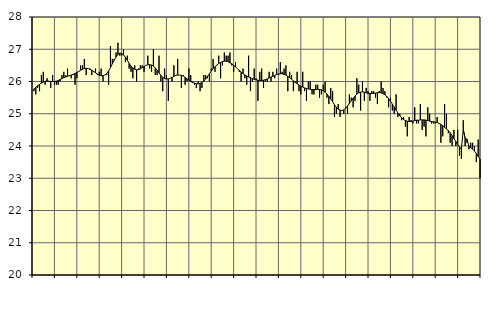
| Category | Piggar | Series 1 |
|---|---|---|
| nan | 25.7 | 25.77 |
| 1.0 | 25.6 | 25.82 |
| 1.0 | 25.8 | 25.87 |
| 1.0 | 25.7 | 25.91 |
| 1.0 | 26.2 | 25.95 |
| 1.0 | 26.3 | 25.98 |
| 1.0 | 25.9 | 26.01 |
| 1.0 | 26.1 | 26.01 |
| 1.0 | 26 | 26.01 |
| 1.0 | 25.8 | 26 |
| 1.0 | 26.2 | 26 |
| 1.0 | 25.9 | 26 |
| nan | 25.9 | 26.01 |
| 2.0 | 25.9 | 26.03 |
| 2.0 | 26 | 26.06 |
| 2.0 | 26.2 | 26.09 |
| 2.0 | 26.3 | 26.12 |
| 2.0 | 26.2 | 26.14 |
| 2.0 | 26.4 | 26.16 |
| 2.0 | 26.2 | 26.18 |
| 2.0 | 26.1 | 26.2 |
| 2.0 | 26.2 | 26.22 |
| 2.0 | 25.9 | 26.25 |
| 2.0 | 26.1 | 26.28 |
| nan | 26.3 | 26.31 |
| 3.0 | 26.5 | 26.35 |
| 3.0 | 26.5 | 26.38 |
| 3.0 | 26.7 | 26.4 |
| 3.0 | 26.2 | 26.41 |
| 3.0 | 26.4 | 26.4 |
| 3.0 | 26.4 | 26.38 |
| 3.0 | 26.2 | 26.35 |
| 3.0 | 26.3 | 26.31 |
| 3.0 | 26.4 | 26.27 |
| 3.0 | 26.2 | 26.23 |
| 3.0 | 26.3 | 26.19 |
| nan | 26.4 | 26.18 |
| 4.0 | 26 | 26.18 |
| 4.0 | 26.2 | 26.2 |
| 4.0 | 26.2 | 26.25 |
| 4.0 | 25.9 | 26.33 |
| 4.0 | 27.1 | 26.43 |
| 4.0 | 26.7 | 26.55 |
| 4.0 | 26.7 | 26.66 |
| 4.0 | 26.9 | 26.76 |
| 4.0 | 27.2 | 26.84 |
| 4.0 | 26.8 | 26.88 |
| 4.0 | 26.8 | 26.87 |
| nan | 27 | 26.83 |
| 5.0 | 26.6 | 26.75 |
| 5.0 | 26.8 | 26.66 |
| 5.0 | 26.4 | 26.56 |
| 5.0 | 26.3 | 26.48 |
| 5.0 | 26.1 | 26.42 |
| 5.0 | 26.5 | 26.38 |
| 5.0 | 26 | 26.36 |
| 5.0 | 26.4 | 26.37 |
| 5.0 | 26.5 | 26.39 |
| 5.0 | 26.5 | 26.43 |
| 5.0 | 26.3 | 26.46 |
| nan | 26.5 | 26.5 |
| 6.0 | 26.8 | 26.52 |
| 6.0 | 26.4 | 26.52 |
| 6.0 | 26.3 | 26.51 |
| 6.0 | 27 | 26.48 |
| 6.0 | 26.2 | 26.42 |
| 6.0 | 26.2 | 26.35 |
| 6.0 | 26.8 | 26.27 |
| 6.0 | 26 | 26.19 |
| 6.0 | 25.7 | 26.13 |
| 6.0 | 26.4 | 26.09 |
| 6.0 | 26.2 | 26.08 |
| nan | 25.4 | 26.08 |
| 7.0 | 26.1 | 26.1 |
| 7.0 | 26 | 26.13 |
| 7.0 | 26.5 | 26.16 |
| 7.0 | 26.2 | 26.19 |
| 7.0 | 26.7 | 26.2 |
| 7.0 | 26.2 | 26.2 |
| 7.0 | 25.8 | 26.19 |
| 7.0 | 26.2 | 26.17 |
| 7.0 | 25.9 | 26.13 |
| 7.0 | 26 | 26.08 |
| 7.0 | 26.4 | 26.04 |
| nan | 26.2 | 26 |
| 8.0 | 26 | 25.97 |
| 8.0 | 25.9 | 25.95 |
| 8.0 | 25.8 | 25.93 |
| 8.0 | 26 | 25.93 |
| 8.0 | 25.7 | 25.94 |
| 8.0 | 25.8 | 25.97 |
| 8.0 | 26.2 | 26.01 |
| 8.0 | 26.2 | 26.08 |
| 8.0 | 26.1 | 26.16 |
| 8.0 | 26 | 26.24 |
| 8.0 | 26.4 | 26.32 |
| nan | 26.7 | 26.4 |
| 9.0 | 26.3 | 26.46 |
| 9.0 | 26.5 | 26.51 |
| 9.0 | 26.8 | 26.56 |
| 9.0 | 26.1 | 26.59 |
| 9.0 | 26.5 | 26.62 |
| 9.0 | 26.9 | 26.63 |
| 9.0 | 26.8 | 26.63 |
| 9.0 | 26.8 | 26.61 |
| 9.0 | 26.9 | 26.58 |
| 9.0 | 26.5 | 26.55 |
| 9.0 | 26.3 | 26.5 |
| nan | 26.6 | 26.45 |
| 10.0 | 26.4 | 26.4 |
| 10.0 | 26.3 | 26.35 |
| 10.0 | 26 | 26.29 |
| 10.0 | 26.4 | 26.24 |
| 10.0 | 26.1 | 26.2 |
| 10.0 | 25.9 | 26.17 |
| 10.0 | 26.8 | 26.14 |
| 10.0 | 25.7 | 26.12 |
| 10.0 | 26 | 26.09 |
| 10.0 | 26.4 | 26.07 |
| 10.0 | 26.1 | 26.05 |
| nan | 25.4 | 26.04 |
| 11.0 | 26.3 | 26.03 |
| 11.0 | 26.4 | 26.03 |
| 11.0 | 25.8 | 26.04 |
| 11.0 | 26 | 26.06 |
| 11.0 | 26 | 26.08 |
| 11.0 | 26.3 | 26.11 |
| 11.0 | 26 | 26.14 |
| 11.0 | 26.3 | 26.16 |
| 11.0 | 26.1 | 26.19 |
| 11.0 | 26.4 | 26.22 |
| 11.0 | 26.2 | 26.23 |
| nan | 26.6 | 26.24 |
| 12.0 | 26.3 | 26.24 |
| 12.0 | 26.4 | 26.22 |
| 12.0 | 26.5 | 26.2 |
| 12.0 | 25.7 | 26.16 |
| 12.0 | 26.3 | 26.12 |
| 12.0 | 26.2 | 26.07 |
| 12.0 | 25.7 | 26.02 |
| 12.0 | 26 | 25.97 |
| 12.0 | 26.3 | 25.93 |
| 12.0 | 25.7 | 25.89 |
| 12.0 | 25.6 | 25.85 |
| nan | 26.3 | 25.83 |
| 13.0 | 25.7 | 25.8 |
| 13.0 | 25.4 | 25.78 |
| 13.0 | 26 | 25.77 |
| 13.0 | 26 | 25.76 |
| 13.0 | 25.6 | 25.75 |
| 13.0 | 25.6 | 25.75 |
| 13.0 | 25.9 | 25.75 |
| 13.0 | 25.9 | 25.76 |
| 13.0 | 25.5 | 25.75 |
| 13.0 | 25.6 | 25.74 |
| 13.0 | 25.9 | 25.71 |
| nan | 26 | 25.67 |
| 14.0 | 25.5 | 25.61 |
| 14.0 | 25.3 | 25.54 |
| 14.0 | 25.8 | 25.46 |
| 14.0 | 25.7 | 25.37 |
| 14.0 | 24.9 | 25.28 |
| 14.0 | 25 | 25.2 |
| 14.0 | 25.3 | 25.14 |
| 14.0 | 24.9 | 25.11 |
| 14.0 | 25.1 | 25.1 |
| 14.0 | 25 | 25.12 |
| 14.0 | 25.2 | 25.17 |
| nan | 25 | 25.24 |
| 15.0 | 25.6 | 25.32 |
| 15.0 | 25.5 | 25.4 |
| 15.0 | 25.2 | 25.48 |
| 15.0 | 25.4 | 25.55 |
| 15.0 | 26.1 | 25.61 |
| 15.0 | 25.9 | 25.65 |
| 15.0 | 25.1 | 25.67 |
| 15.0 | 26 | 25.68 |
| 15.0 | 25.4 | 25.67 |
| 15.0 | 25.8 | 25.65 |
| 15.0 | 25.7 | 25.63 |
| nan | 25.4 | 25.63 |
| 16.0 | 25.7 | 25.63 |
| 16.0 | 25.7 | 25.63 |
| 16.0 | 25.5 | 25.64 |
| 16.0 | 25.3 | 25.65 |
| 16.0 | 25.7 | 25.66 |
| 16.0 | 26 | 25.65 |
| 16.0 | 25.8 | 25.62 |
| 16.0 | 25.7 | 25.59 |
| 16.0 | 25.5 | 25.54 |
| 16.0 | 25.2 | 25.47 |
| 16.0 | 25.5 | 25.39 |
| nan | 25.1 | 25.3 |
| 17.0 | 25 | 25.21 |
| 17.0 | 25.6 | 25.11 |
| 17.0 | 24.9 | 25.02 |
| 17.0 | 25 | 24.94 |
| 17.0 | 24.8 | 24.88 |
| 17.0 | 24.9 | 24.82 |
| 17.0 | 24.6 | 24.79 |
| 17.0 | 24.3 | 24.77 |
| 17.0 | 24.9 | 24.76 |
| 17.0 | 24.8 | 24.76 |
| 17.0 | 24.7 | 24.77 |
| nan | 25.2 | 24.79 |
| 18.0 | 24.7 | 24.8 |
| 18.0 | 24.7 | 24.8 |
| 18.0 | 25.3 | 24.81 |
| 18.0 | 24.5 | 24.81 |
| 18.0 | 24.6 | 24.81 |
| 18.0 | 24.3 | 24.8 |
| 18.0 | 25.2 | 24.79 |
| 18.0 | 25 | 24.77 |
| 18.0 | 24.7 | 24.76 |
| 18.0 | 24.7 | 24.75 |
| 18.0 | 24.7 | 24.74 |
| nan | 24.9 | 24.73 |
| 19.0 | 24.7 | 24.7 |
| 19.0 | 24.1 | 24.67 |
| 19.0 | 24.3 | 24.63 |
| 19.0 | 25.3 | 24.58 |
| 19.0 | 25 | 24.53 |
| 19.0 | 24.4 | 24.48 |
| 19.0 | 24.1 | 24.41 |
| 19.0 | 24 | 24.32 |
| 19.0 | 24.5 | 24.23 |
| 19.0 | 24 | 24.14 |
| 19.0 | 24.5 | 24.05 |
| nan | 23.7 | 23.97 |
| 20.0 | 23.6 | 23.9 |
| 20.0 | 24.8 | 24.51 |
| 20.0 | 24 | 24.24 |
| 20.0 | 24.1 | 24.21 |
| 20.0 | 23.9 | 23.99 |
| 20.0 | 24.1 | 23.95 |
| 20.0 | 24.1 | 23.9 |
| 20.0 | 24 | 23.84 |
| 20.0 | 23.5 | 23.77 |
| 20.0 | 24.2 | 23.68 |
| 20.0 | 23 | 23.59 |